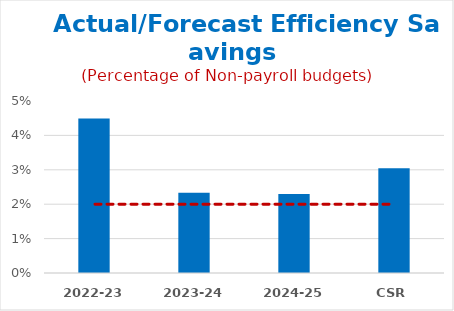
| Category | Forecast Efficiency Savings |
|---|---|
| 2022-23 | 0.045 |
| 2023-24 | 0.023 |
| 2024-25 | 0.023 |
| CSR | 0.03 |